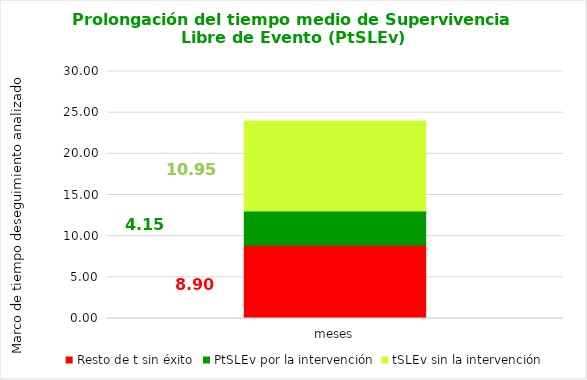
| Category | Resto de t sin éxito | PtSLEv por la intervención | tSLEv sin la intervención |
|---|---|---|---|
| meses | 8.9 | 4.147 | 10.953 |